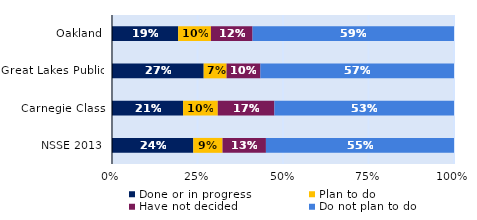
| Category | Done or in progress | Plan to do | Have not decided | Do not plan to do |
|---|---|---|---|---|
| Oakland | 0.193 | 0.096 | 0.122 | 0.589 |
| Great Lakes Public | 0.268 | 0.067 | 0.099 | 0.566 |
| Carnegie Class | 0.208 | 0.101 | 0.166 | 0.525 |
| NSSE 2013 | 0.238 | 0.086 | 0.127 | 0.55 |